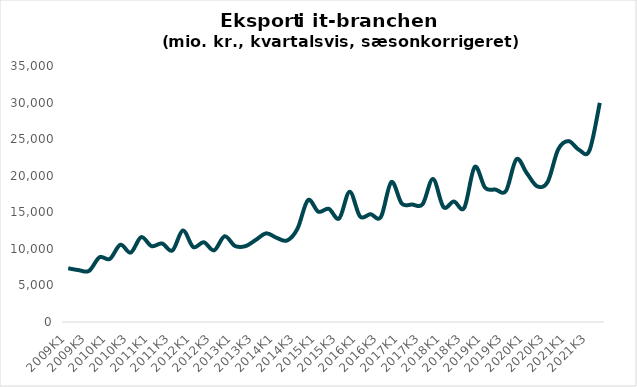
| Category | Samlet eksport i It-branchen |
|---|---|
| 2009K1 | 7342 |
| 2009K2 | 7089 |
| 2009K3 | 6990 |
| 2009K4 | 8843 |
| 2010K1 | 8631 |
| 2010K2 | 10560 |
| 2010K3 | 9493 |
| 2010K4 | 11601 |
| 2011K1 | 10370 |
| 2011K2 | 10737 |
| 2011K3 | 9776 |
| 2011K4 | 12514 |
| 2012K1 | 10246 |
| 2012K2 | 10903 |
| 2012K3 | 9797 |
| 2012K4 | 11716 |
| 2013K1 | 10401 |
| 2013K2 | 10370 |
| 2013K3 | 11226 |
| 2013K4 | 12118 |
| 2014K1 | 11507 |
| 2014K2 | 11139 |
| 2014K3 | 12772 |
| 2014K4 | 16658 |
| 2015K1 | 15078 |
| 2015K2 | 15474 |
| 2015K3 | 14162 |
| 2015K4 | 17805 |
| 2016K1 | 14426 |
| 2016K2 | 14740 |
| 2016K3 | 14366 |
| 2016K4 | 19129 |
| 2017K1 | 16201 |
| 2017K2 | 16059 |
| 2017K3 | 16101 |
| 2017K4 | 19552 |
| 2018K1 | 15720 |
| 2018K2 | 16472 |
| 2018K3 | 15619 |
| 2018K4 | 21191 |
| 2019K1 | 18351 |
| 2019K2 | 18100 |
| 2019K3 | 17922 |
| 2019K4 | 22246 |
| 2020K1 | 20345 |
| 2020K2 | 18549 |
| 2020K3 | 19156 |
| 2020K4 | 23567 |
| 2021K1 | 24734 |
| 2021K2 | 23547 |
| 2021K3 | 23423 |
| 2021K4 | 29961 |